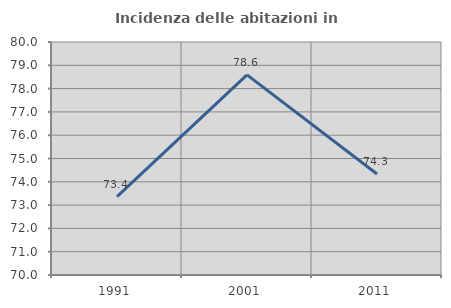
| Category | Incidenza delle abitazioni in proprietà  |
|---|---|
| 1991.0 | 73.363 |
| 2001.0 | 78.589 |
| 2011.0 | 74.336 |